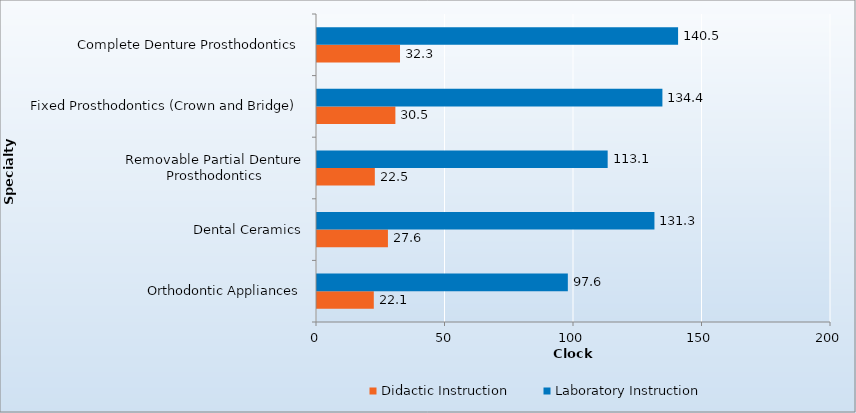
| Category | Didactic Instruction | Laboratory Instruction |
|---|---|---|
| Orthodontic Appliances | 22.1 | 97.6 |
| Dental Ceramics | 27.6 | 131.3 |
| Removable Partial Denture Prosthodontics | 22.5 | 113.1 |
| Fixed Prosthodontics (Crown and Bridge) | 30.5 | 134.4 |
| Complete Denture Prosthodontics | 32.3 | 140.5 |